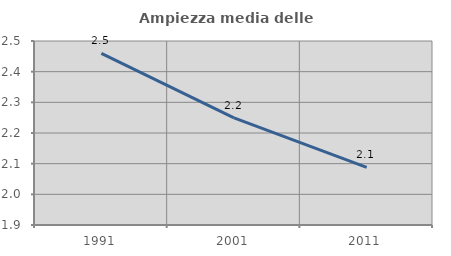
| Category | Ampiezza media delle famiglie |
|---|---|
| 1991.0 | 2.459 |
| 2001.0 | 2.249 |
| 2011.0 | 2.088 |